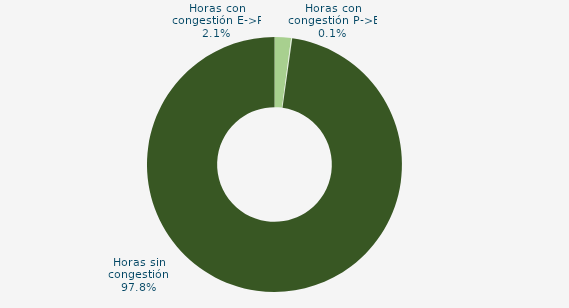
| Category | Horas con congestión E->P |
|---|---|
| Horas con congestión E->P | 2.083 |
| Horas con congestión P->E | 0.139 |
| Horas sin congestión | 97.778 |